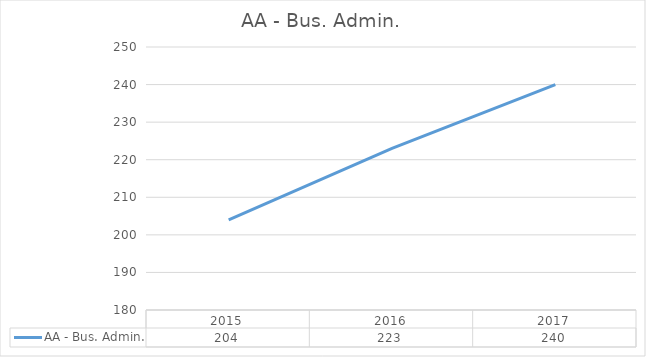
| Category | AA - Bus. Admin. |
|---|---|
| 2015.0 | 204 |
| 2016.0 | 223 |
| 2017.0 | 240 |